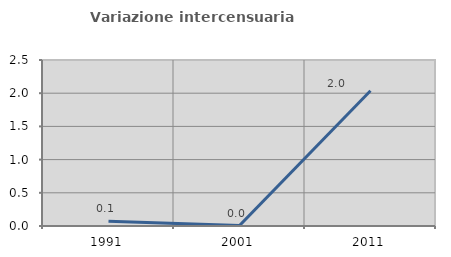
| Category | Variazione intercensuaria annua |
|---|---|
| 1991.0 | 0.071 |
| 2001.0 | 0.006 |
| 2011.0 | 2.036 |